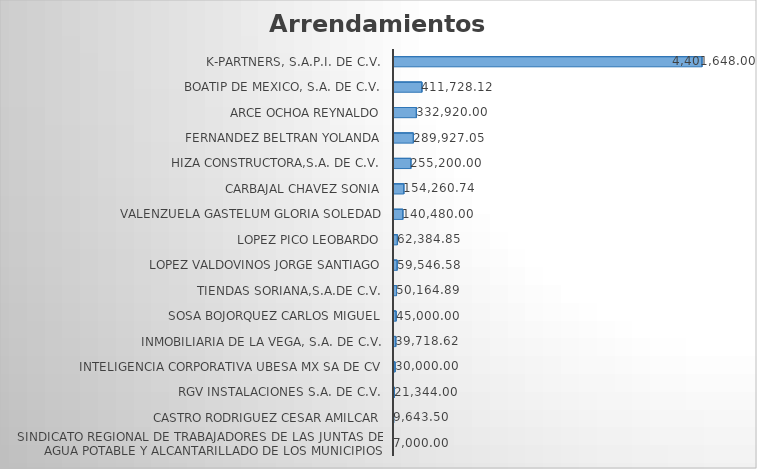
| Category | SUMA |
|---|---|
| SINDICATO REGIONAL DE TRABAJADORES DE LAS JUNTAS DE AGUA POTABLE Y ALCANTARILLADO DE LOS MUNICIPIOS | 7000 |
| CASTRO RODRIGUEZ CESAR AMILCAR | 9643.5 |
| RGV INSTALACIONES S.A. DE C.V. | 21344 |
| INTELIGENCIA CORPORATIVA UBESA MX SA DE CV | 30000 |
| INMOBILIARIA DE LA VEGA, S.A. DE C.V. | 39718.62 |
| SOSA BOJORQUEZ CARLOS MIGUEL | 45000 |
| TIENDAS SORIANA,S.A.DE C.V. | 50164.89 |
| LOPEZ VALDOVINOS JORGE SANTIAGO | 59546.58 |
| LOPEZ PICO LEOBARDO | 62384.85 |
| VALENZUELA GASTELUM GLORIA SOLEDAD | 140480 |
| CARBAJAL CHAVEZ SONIA | 154260.74 |
| HIZA CONSTRUCTORA,S.A. DE C.V. | 255200 |
| FERNANDEZ BELTRAN YOLANDA | 289927.05 |
| ARCE OCHOA REYNALDO | 332920 |
| BOATIP DE MEXICO, S.A. DE C.V. | 411728.12 |
| K-PARTNERS, S.A.P.I. DE C.V. | 4401648 |